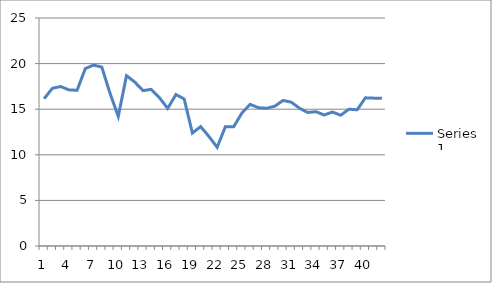
| Category | Series 0 |
|---|---|
| 0 | 16.15 |
| 1 | 17.29 |
| 2 | 17.487 |
| 3 | 17.121 |
| 4 | 17.075 |
| 5 | 19.456 |
| 6 | 19.836 |
| 7 | 19.623 |
| 8 | 16.741 |
| 9 | 14.214 |
| 10 | 18.679 |
| 11 | 17.978 |
| 12 | 17.038 |
| 13 | 17.175 |
| 14 | 16.258 |
| 15 | 15.086 |
| 16 | 16.608 |
| 17 | 16.122 |
| 18 | 12.383 |
| 19 | 13.094 |
| 20 | 12.019 |
| 21 | 10.818 |
| 22 | 13.074 |
| 23 | 13.063 |
| 24 | 14.57 |
| 25 | 15.532 |
| 26 | 15.172 |
| 27 | 15.103 |
| 28 | 15.326 |
| 29 | 15.959 |
| 30 | 15.773 |
| 31 | 15.105 |
| 32 | 14.646 |
| 33 | 14.727 |
| 34 | 14.364 |
| 35 | 14.693 |
| 36 | 14.335 |
| 37 | 15.003 |
| 38 | 14.935 |
| 39 | 16.247 |
| 40 | 16.214 |
| 41 | 16.212 |